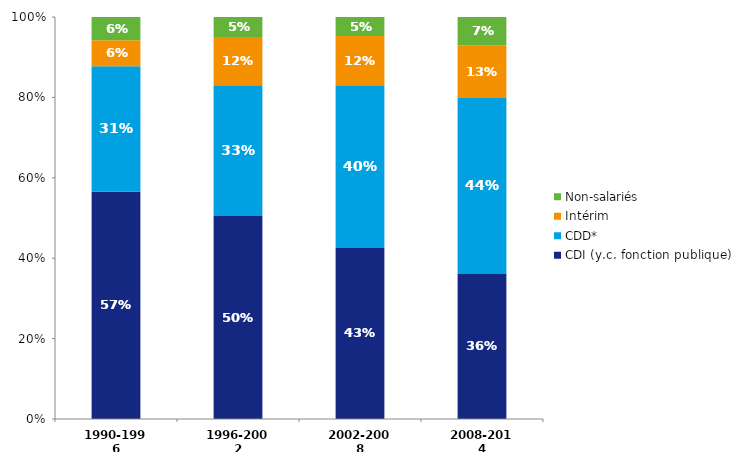
| Category | CDI (y.c. fonction publique) | CDD* | Intérim | Non-salariés |
|---|---|---|---|---|
| 1990-1996 | 0.566 | 0.312 | 0.064 | 0.058 |
| 1996-2002 | 0.505 | 0.326 | 0.12 | 0.049 |
| 2002-2008 | 0.426 | 0.405 | 0.122 | 0.048 |
| 2008-2014 | 0.361 | 0.438 | 0.131 | 0.07 |